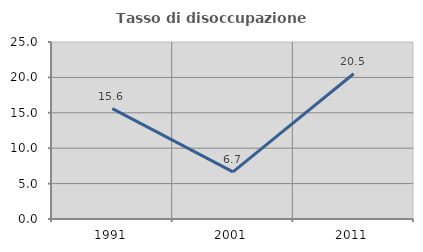
| Category | Tasso di disoccupazione giovanile  |
|---|---|
| 1991.0 | 15.596 |
| 2001.0 | 6.667 |
| 2011.0 | 20.513 |